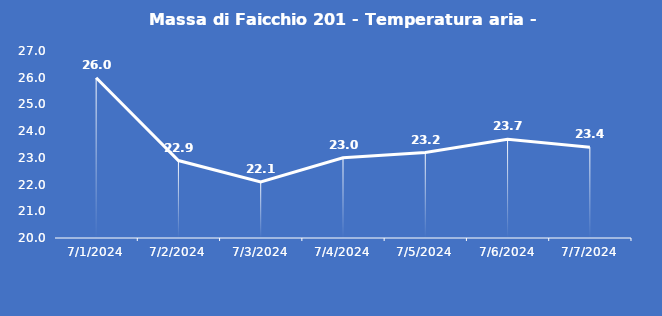
| Category | Massa di Faicchio 201 - Temperatura aria - Grezzo (°C) |
|---|---|
| 7/1/24 | 26 |
| 7/2/24 | 22.9 |
| 7/3/24 | 22.1 |
| 7/4/24 | 23 |
| 7/5/24 | 23.2 |
| 7/6/24 | 23.7 |
| 7/7/24 | 23.4 |